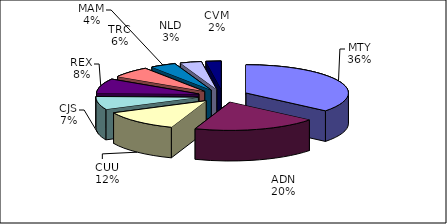
| Category | Series 0 |
|---|---|
| MTY | 69312 |
| ADN | 37973 |
| CUU | 24037 |
| CJS | 14357 |
| REX | 16264 |
| TRC | 12267 |
| MAM | 7855 |
| NLD | 6530 |
| CVM | 4639 |